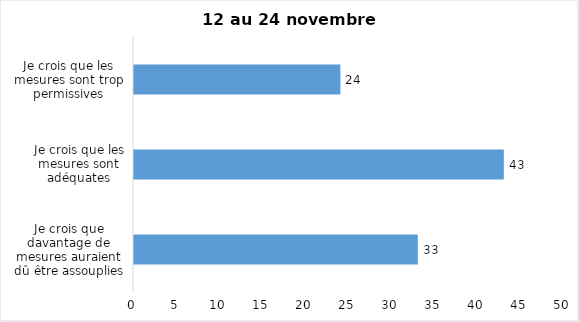
| Category | Series 0 |
|---|---|
| Je crois que davantage de mesures auraient dû être assouplies | 33 |
| Je crois que les mesures sont adéquates | 43 |
| Je crois que les mesures sont trop permissives | 24 |